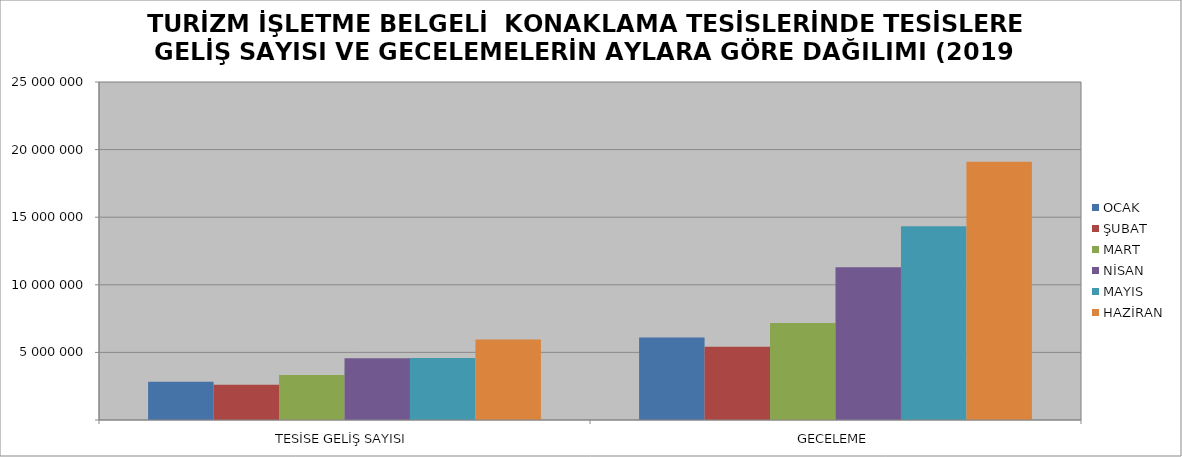
| Category | OCAK | ŞUBAT | MART | NİSAN | MAYIS | HAZİRAN |
|---|---|---|---|---|---|---|
| TESİSE GELİŞ SAYISI | 2833509 | 2607189 | 3326719 | 4561709 | 4585981 | 5949977 |
| GECELEME | 6098050 | 5425989 | 7182593 | 11302946 | 14338328 | 19092571 |